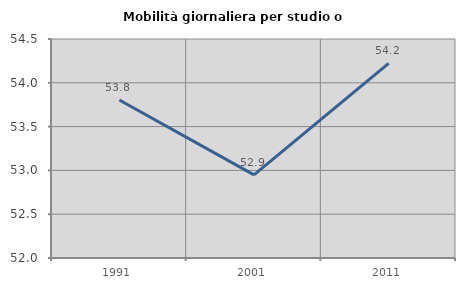
| Category | Mobilità giornaliera per studio o lavoro |
|---|---|
| 1991.0 | 53.804 |
| 2001.0 | 52.949 |
| 2011.0 | 54.221 |